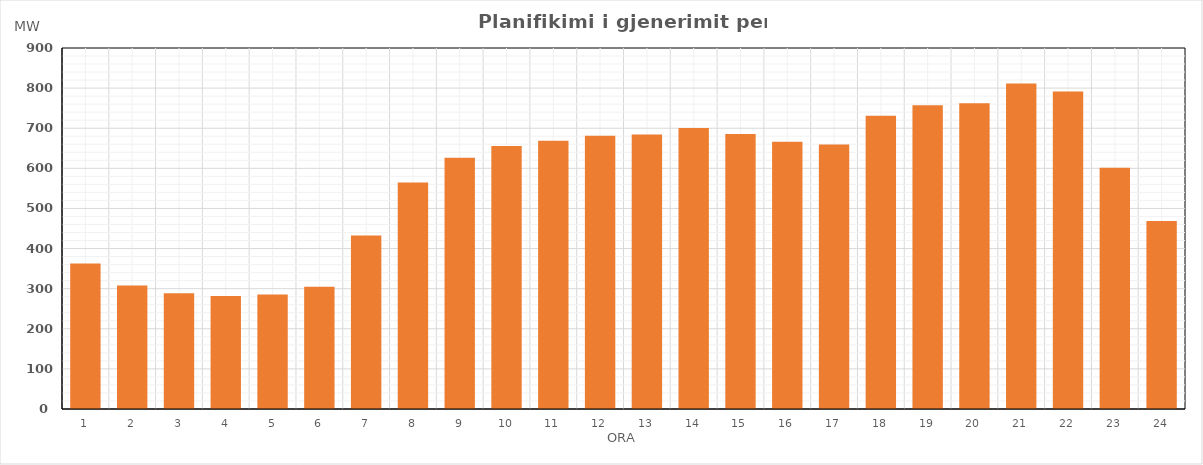
| Category | Max (MW) |
|---|---|
| 0 | 362.61 |
| 1 | 307.61 |
| 2 | 288.61 |
| 3 | 281.6 |
| 4 | 285.6 |
| 5 | 304.48 |
| 6 | 432.43 |
| 7 | 564.42 |
| 8 | 626.45 |
| 9 | 655.51 |
| 10 | 668.52 |
| 11 | 681.49 |
| 12 | 684.52 |
| 13 | 700.49 |
| 14 | 685.48 |
| 15 | 666.45 |
| 16 | 659.49 |
| 17 | 731.4 |
| 18 | 757.43 |
| 19 | 762.43 |
| 20 | 811.43 |
| 21 | 791.48 |
| 22 | 601.49 |
| 23 | 468.55 |